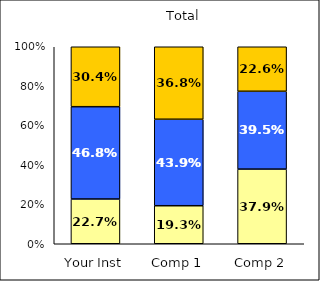
| Category | Low Academic Self-Concept | Average Academic Self-Concept | High Academic Self-Concept |
|---|---|---|---|
| Your Inst | 0.227 | 0.468 | 0.304 |
| Comp 1 | 0.193 | 0.439 | 0.368 |
| Comp 2 | 0.379 | 0.395 | 0.226 |